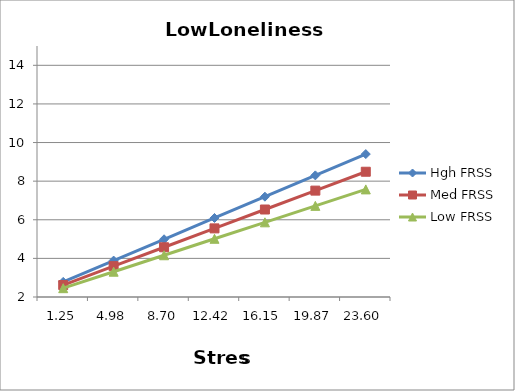
| Category | Hgh FRSS | Med FRSS | Low FRSS |
|---|---|---|---|
| 1.251999999999999 | 2.782 | 2.62 | 2.457 |
| 4.975999999999999 | 3.886 | 3.598 | 3.31 |
| 8.7 | 4.989 | 4.576 | 4.162 |
| 12.424 | 6.092 | 5.554 | 5.015 |
| 16.148 | 7.196 | 6.532 | 5.868 |
| 19.872 | 8.299 | 7.51 | 6.72 |
| 23.596 | 9.402 | 8.488 | 7.573 |